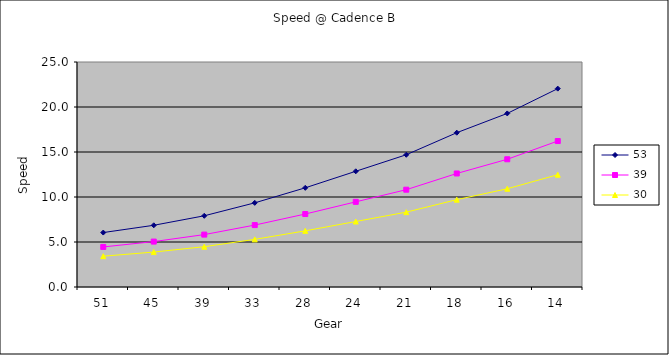
| Category | 53 | 39 | 30 |
|---|---|---|---|
| 51.0 | 6.05 | 4.452 | 3.425 |
| 45.0 | 6.857 | 5.046 | 3.881 |
| 39.0 | 7.912 | 5.822 | 4.478 |
| 33.0 | 9.35 | 6.881 | 5.293 |
| 28.0 | 11.02 | 8.109 | 6.238 |
| 24.0 | 12.857 | 9.461 | 7.277 |
| 21.0 | 14.694 | 10.812 | 8.317 |
| 18.0 | 17.143 | 12.614 | 9.703 |
| 16.0 | 19.285 | 14.191 | 10.916 |
| 14.0 | 22.04 | 16.218 | 12.476 |